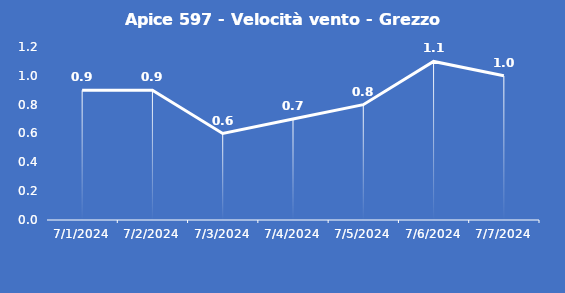
| Category | Apice 597 - Velocità vento - Grezzo (m/s) |
|---|---|
| 7/1/24 | 0.9 |
| 7/2/24 | 0.9 |
| 7/3/24 | 0.6 |
| 7/4/24 | 0.7 |
| 7/5/24 | 0.8 |
| 7/6/24 | 1.1 |
| 7/7/24 | 1 |